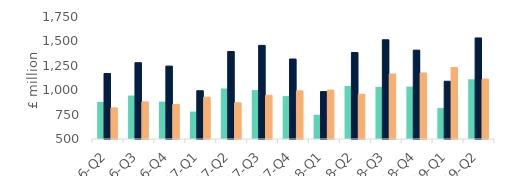
| Category | First-time
buyers | Homemovers | Homowner remortgaging |
|---|---|---|---|
| 16-Q2 | 880.489 | 1171.364 | 818.661 |
| 16-Q3 | 945.203 | 1281.796 | 880.012 |
| 16-Q4 | 883.372 | 1247.017 | 853.509 |
| 17-Q1 | 781.078 | 994.423 | 928.449 |
| 17-Q2 | 1017.404 | 1396.407 | 870.301 |
| 17-Q3 | 1001.308 | 1459.499 | 947.477 |
| 17-Q4 | 939.498 | 1319.394 | 993.236 |
| 18-Q1 | 748.49 | 985.977 | 1000.93 |
| 18-Q2 | 1042.168 | 1386.083 | 958.801 |
| 18-Q3 | 1034.689 | 1516.609 | 1166.756 |
| 18-Q4 | 1036.811 | 1410.294 | 1176.702 |
| 19-Q1 | 817.11 | 1091.682 | 1231.741 |
| 19-Q2 | 1111.59 | 1535.293 | 1113.353 |